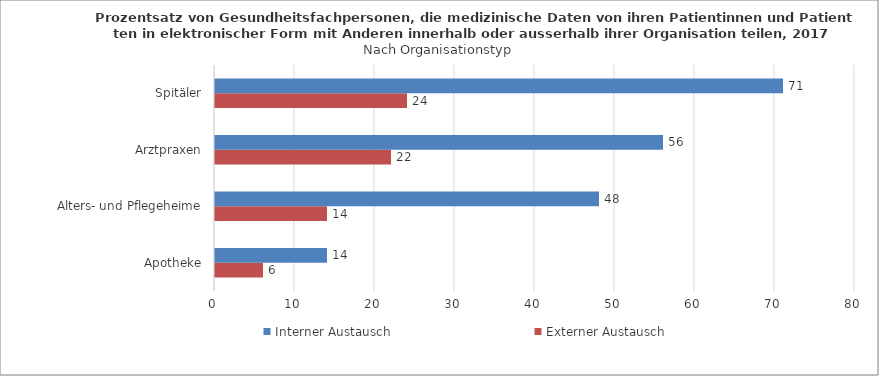
| Category | Externer Austausch | Interner Austausch |
|---|---|---|
| Apotheke | 6 | 14 |
| Alters- und Pflegeheime | 14 | 48 |
| Arztpraxen | 22 | 56 |
| Spitäler | 24 | 71 |